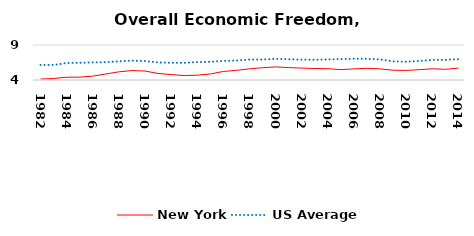
| Category | New York | US Average |
|---|---|---|
| 1982.0 | 4.134 | 6.149 |
| 1983.0 | 4.218 | 6.152 |
| 1984.0 | 4.396 | 6.429 |
| 1985.0 | 4.409 | 6.464 |
| 1986.0 | 4.549 | 6.512 |
| 1987.0 | 4.857 | 6.552 |
| 1988.0 | 5.166 | 6.659 |
| 1989.0 | 5.35 | 6.767 |
| 1990.0 | 5.281 | 6.71 |
| 1991.0 | 4.935 | 6.502 |
| 1992.0 | 4.774 | 6.463 |
| 1993.0 | 4.634 | 6.446 |
| 1994.0 | 4.69 | 6.563 |
| 1995.0 | 4.862 | 6.593 |
| 1996.0 | 5.219 | 6.73 |
| 1997.0 | 5.382 | 6.781 |
| 1998.0 | 5.595 | 6.926 |
| 1999.0 | 5.758 | 6.925 |
| 2000.0 | 5.87 | 7.031 |
| 2001.0 | 5.776 | 6.969 |
| 2002.0 | 5.7 | 6.912 |
| 2003.0 | 5.64 | 6.892 |
| 2004.0 | 5.611 | 6.934 |
| 2005.0 | 5.485 | 6.99 |
| 2006.0 | 5.587 | 7.048 |
| 2007.0 | 5.668 | 7.028 |
| 2008.0 | 5.589 | 6.935 |
| 2009.0 | 5.396 | 6.668 |
| 2010.0 | 5.366 | 6.605 |
| 2011.0 | 5.473 | 6.72 |
| 2012.0 | 5.602 | 6.883 |
| 2013.0 | 5.531 | 6.881 |
| 2014.0 | 5.699 | 6.973 |